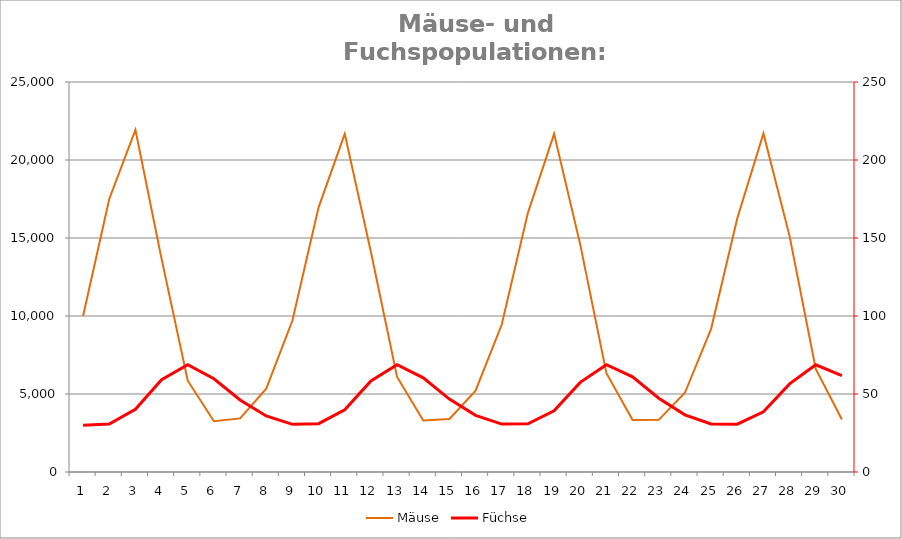
| Category | Mäuse |
|---|---|
| 0 | 10000 |
| 1 | 17500 |
| 2 | 21929.688 |
| 3 | 13664.937 |
| 4 | 5850.855 |
| 5 | 3254.836 |
| 6 | 3434.579 |
| 7 | 5340.396 |
| 8 | 9711.82 |
| 9 | 16967.882 |
| 10 | 21674.258 |
| 11 | 14099.242 |
| 12 | 6092.987 |
| 13 | 3300.814 |
| 14 | 3398.003 |
| 15 | 5217.935 |
| 16 | 9453.864 |
| 17 | 16612.918 |
| 18 | 21673.463 |
| 19 | 14574.684 |
| 20 | 6333.13 |
| 21 | 3332.163 |
| 22 | 3344.68 |
| 23 | 5076.793 |
| 24 | 9177.845 |
| 25 | 16253.499 |
| 26 | 21705.869 |
| 27 | 15120.108 |
| 28 | 6606.466 |
| 29 | 3365.382 |